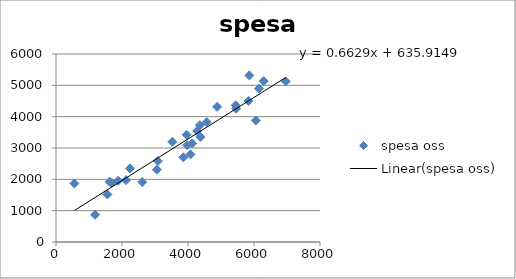
| Category | spesa oss |
|---|---|
| 3089.0 | 2583.209 |
| 4128.0 | 3147.622 |
| 4357.0 | 3726.873 |
| 6961.0 | 5126.689 |
| 4074.0 | 2795.83 |
| 4375.0 | 3350.928 |
| 5832.0 | 4501.51 |
| 1886.0 | 1958.067 |
| 4883.0 | 4314.236 |
| 2120.0 | 1974.305 |
| 5445.0 | 4362.028 |
| 1685.0 | 1887.086 |
| 6151.0 | 4893.645 |
| 3058.0 | 2307.871 |
| 2613.0 | 1913.462 |
| 6055.0 | 3878.502 |
| 3526.0 | 3199.949 |
| 3959.0 | 3423.962 |
| 2241.0 | 2348.715 |
| 1557.0 | 1517.77 |
| 4277.0 | 3540.31 |
| 557.0 | 1867.688 |
| 3858.0 | 2703.2 |
| 1625.0 | 1923.566 |
| 6293.0 | 5132.527 |
| 4570.0 | 3826.52 |
| 5457.0 | 4253.049 |
| 5858.0 | 5316.638 |
| 1184.0 | 869.146 |
| 3973.0 | 3089.94 |